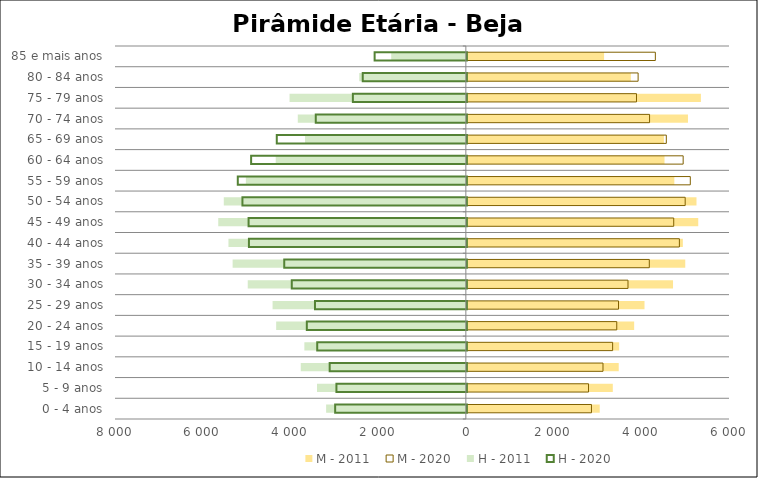
| Category | M - 2011 | M - 2020 | H - 2011 | H - 2020 |
|---|---|---|---|---|
| 0 - 4 anos | 3030 | 2841 | -3186 | -3003 |
| 5 - 9 anos | 3328 | 2774 | -3394 | -2974 |
| 10 - 14 anos | 3463 | 3104 | -3764 | -3128 |
| 15 - 19 anos | 3473 | 3324 | -3682 | -3412 |
| 20 - 24 anos | 3815 | 3418 | -4325 | -3649 |
| 25 - 29 anos | 4051 | 3458 | -4407 | -3463 |
| 30 - 34 anos | 4701 | 3674 | -4973 | -3992 |
| 35 - 39 anos | 4980 | 4160 | -5318 | -4164 |
| 40 - 44 anos | 4925 | 4846 | -5413 | -4969 |
| 45 - 49 anos | 5276 | 4717 | -5646 | -4977 |
| 50 - 54 anos | 5236 | 4978 | -5519 | -5117 |
| 55 - 59 anos | 4731 | 5095 | -5016 | -5223 |
| 60 - 64 anos | 4507 | 4932 | -4335 | -4919 |
| 65 - 69 anos | 4493 | 4548 | -3667 | -4334 |
| 70 - 74 anos | 5042 | 4166 | -3832 | -3445 |
| 75 - 79 anos | 5337 | 3868 | -4020 | -2599 |
| 80 - 84 anos | 3739 | 3905 | -2430 | -2374 |
| 85 e mais anos | 3129 | 4298 | -1702 | -2103 |